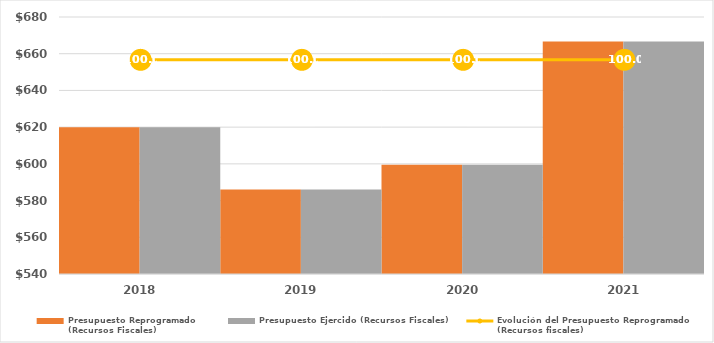
| Category | Presupuesto Reprogramado
(Recursos Fiscales) | Presupuesto Ejercido (Recursos Fiscales) |
|---|---|---|
| 2018.0 | 619970.704 | 619970.704 |
| 2019.0 | 585973.956 | 585964.33 |
| 2020.0 | 599548.578 | 599548.578 |
| 2021.0 | 666637.126 | 666637.126 |